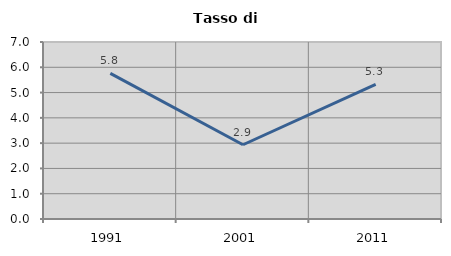
| Category | Tasso di disoccupazione   |
|---|---|
| 1991.0 | 5.762 |
| 2001.0 | 2.937 |
| 2011.0 | 5.325 |